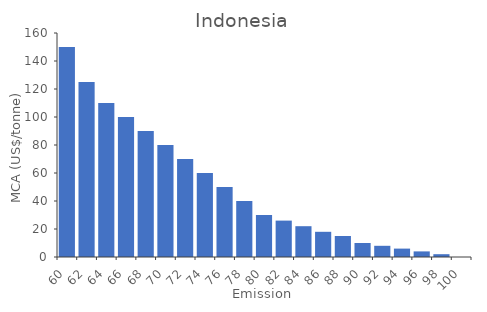
| Category | TCA (million $) |
|---|---|
| 60.0 | 150 |
| 62.0 | 125 |
| 64.0 | 110 |
| 66.0 | 100 |
| 68.0 | 90 |
| 70.0 | 80 |
| 72.0 | 70 |
| 74.0 | 60 |
| 76.0 | 50 |
| 78.0 | 40 |
| 80.0 | 30 |
| 82.0 | 26 |
| 84.0 | 22 |
| 86.0 | 18 |
| 88.0 | 15 |
| 90.0 | 10 |
| 92.0 | 8 |
| 94.0 | 6 |
| 96.0 | 4 |
| 98.0 | 2 |
| 100.0 | 0 |